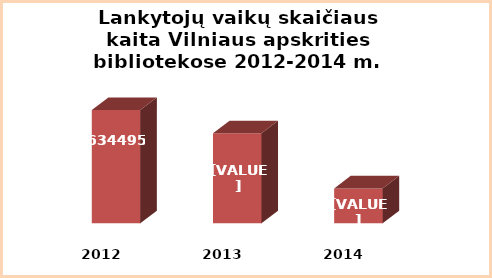
| Category | Series 0 |
|---|---|
| 2012.0 | 634495 |
| 2013.0 | 626382 |
| 2014.0 | 607162 |